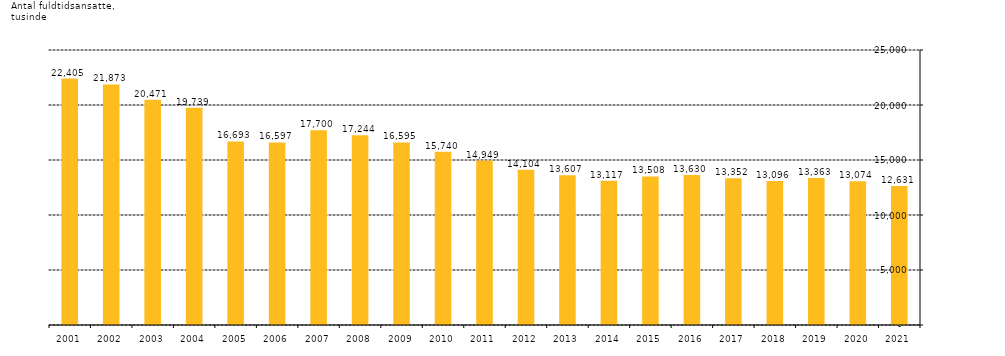
| Category | Series 0 |
|---|---|
| 2021.0 | 12631.205 |
| 2020.0 | 13074.03 |
| 2019.0 | 13363.3 |
| 2018.0 | 13096.048 |
| 2017.0 | 13352 |
| 2016.0 | 13630 |
| 2015.0 | 13508 |
| 2014.0 | 13117 |
| 2013.0 | 13607 |
| 2012.0 | 14104 |
| 2011.0 | 14949 |
| 2010.0 | 15740 |
| 2009.0 | 16595 |
| 2008.0 | 17244 |
| 2007.0 | 17700 |
| 2006.0 | 16597 |
| 2005.0 | 16693 |
| 2004.0 | 19739 |
| 2003.0 | 20471 |
| 2002.0 | 21873 |
| 2001.0 | 22405 |